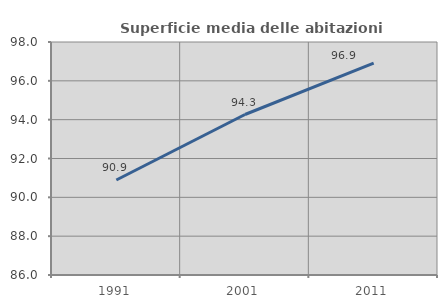
| Category | Superficie media delle abitazioni occupate |
|---|---|
| 1991.0 | 90.894 |
| 2001.0 | 94.266 |
| 2011.0 | 96.917 |